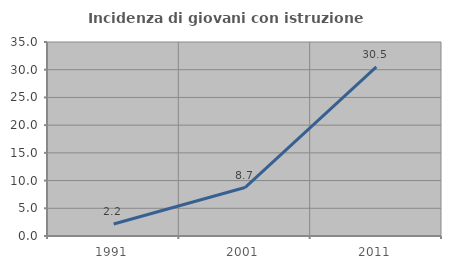
| Category | Incidenza di giovani con istruzione universitaria |
|---|---|
| 1991.0 | 2.174 |
| 2001.0 | 8.738 |
| 2011.0 | 30.508 |